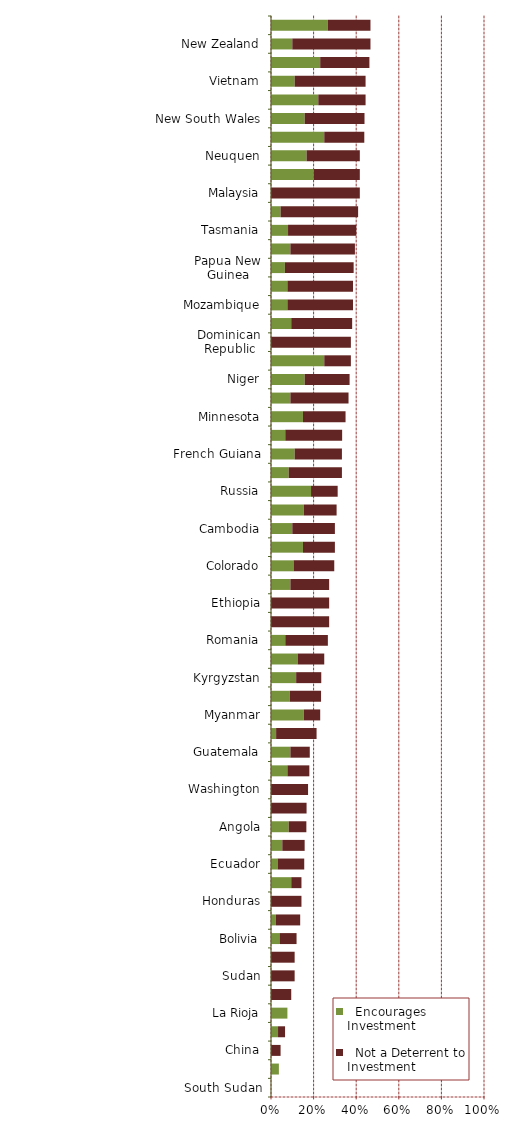
| Category |   Encourages Investment |   Not a Deterrent to Investment |
|---|---|---|
| South Sudan | 0 | 0 |
| Venezuela | 0.037 | 0 |
| China | 0 | 0.045 |
| Zimbabwe | 0.033 | 0.033 |
| La Rioja | 0.077 | 0 |
| Mendoza | 0 | 0.095 |
| Sudan | 0 | 0.111 |
| Chubut | 0 | 0.111 |
| Bolivia | 0.04 | 0.08 |
| Indonesia | 0.023 | 0.114 |
| Honduras | 0 | 0.143 |
| Philippines | 0.095 | 0.048 |
| Ecuador | 0.031 | 0.125 |
| Mongolia | 0.053 | 0.105 |
| Angola | 0.083 | 0.083 |
| Egypt | 0 | 0.167 |
| Washington | 0 | 0.174 |
| Montana | 0.077 | 0.103 |
| Guatemala | 0.091 | 0.091 |
| California | 0.024 | 0.19 |
| Myanmar | 0.154 | 0.077 |
| Democratic Republic of Congo (DRC) | 0.088 | 0.147 |
| Kyrgyzstan | 0.118 | 0.118 |
| Hungary | 0.125 | 0.125 |
| Romania | 0.067 | 0.2 |
| Solomon Islands | 0 | 0.273 |
| Ethiopia | 0 | 0.273 |
| South Africa | 0.091 | 0.182 |
| Colorado | 0.106 | 0.191 |
| Santa Cruz | 0.15 | 0.15 |
| Cambodia | 0.1 | 0.2 |
| Kenya | 0.154 | 0.154 |
| Russia | 0.188 | 0.125 |
| Central African Republic | 0.083 | 0.25 |
| French Guiana | 0.111 | 0.222 |
| Greece | 0.067 | 0.267 |
| Minnesota | 0.15 | 0.2 |
| Bulgaria | 0.091 | 0.273 |
| Niger | 0.158 | 0.211 |
| Rio Negro | 0.25 | 0.125 |
| Dominican Republic | 0 | 0.375 |
| Guinea(Conakry) | 0.095 | 0.286 |
| Mozambique | 0.077 | 0.308 |
| Kazakhstan | 0.077 | 0.308 |
| Papua New Guinea | 0.065 | 0.323 |
| Victoria | 0.091 | 0.303 |
| Tasmania | 0.08 | 0.32 |
| Brazil | 0.045 | 0.364 |
| Malaysia | 0 | 0.417 |
| British Columbia | 0.201 | 0.216 |
| Neuquen | 0.167 | 0.25 |
| Madagascar | 0.25 | 0.188 |
| New South Wales | 0.158 | 0.281 |
| India | 0.222 | 0.222 |
| Vietnam | 0.111 | 0.333 |
| Catamarca | 0.231 | 0.231 |
| New Zealand | 0.1 | 0.367 |
| Jujuy | 0.267 | 0.2 |